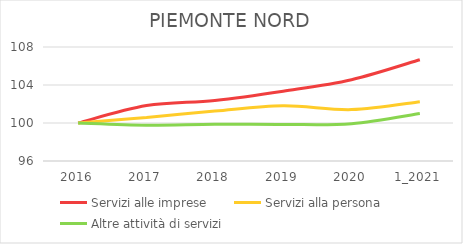
| Category | Servizi alle imprese | Servizi alla persona | Altre attività di servizi |
|---|---|---|---|
| 2016 | 100 | 100 | 100 |
| 2017 | 101.833 | 100.578 | 99.77 |
| 2018 | 102.375 | 101.258 | 99.871 |
| 2019 | 103.348 | 101.818 | 99.843 |
| 2020 | 104.559 | 101.411 | 99.926 |
| 1_2021 | 106.663 | 102.243 | 101.004 |